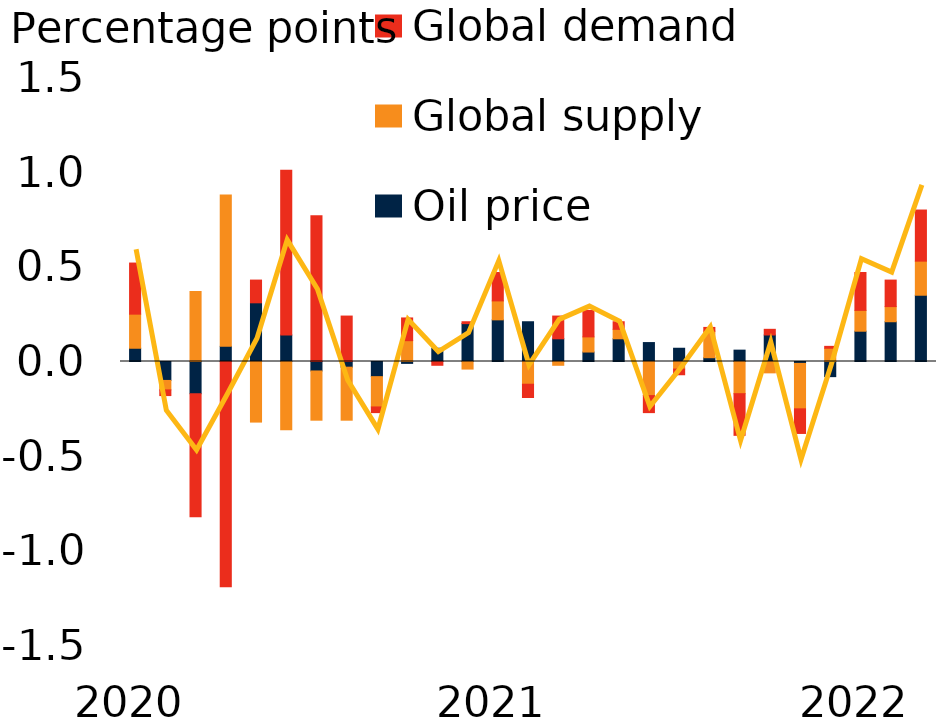
| Category | Oil price | Global supply | Global demand |
|---|---|---|---|
| 2020 | 0.07 | 0.18 | 0.27 |
| 2020m2 | -0.1 | -0.05 | -0.03 |
| 2020m3 | -0.17 | 0.37 | -0.65 |
| 2020m4 | 0.08 | 0.8 | -1.19 |
| 2020m5 | 0.31 | -0.32 | 0.12 |
| 2020m6 | 0.14 | -0.36 | 0.87 |
| 2020m7 | -0.05 | -0.26 | 0.77 |
| 2020m8 | -0.03 | -0.28 | 0.24 |
| 2020m9 | -0.08 | -0.16 | -0.03 |
| 2020m10 | -0.01 | 0.11 | 0.12 |
| 2020m11 | 0.07 | 0 | -0.02 |
| 2020m12 | 0.2 | -0.04 | 0.01 |
| 2021 | 0.22 | 0.1 | 0.15 |
| 2021m2 | 0.21 | -0.12 | -0.07 |
| 2021m3 | 0.12 | -0.02 | 0.12 |
| 2021m4 | 0.05 | 0.08 | 0.14 |
| 2021m5 | 0.12 | 0.05 | 0.04 |
| 2021m6 | 0.1 | -0.18 | -0.09 |
| 2021m7 | 0.07 | -0.04 | -0.03 |
| 2021m8 | 0.02 | 0.14 | 0.02 |
| 2021m9 | 0.06 | -0.17 | -0.22 |
| 2021m10 | 0.14 | -0.06 | 0.03 |
| 2021m11 | -0.01 | -0.24 | -0.13 |
| 2021m12 | -0.08 | 0.07 | 0.01 |
| 2022 | 0.16 | 0.11 | 0.2 |
| 2022m2 | 0.21 | 0.08 | 0.14 |
| 2022m3 | 0.35 | 0.18 | 0.27 |